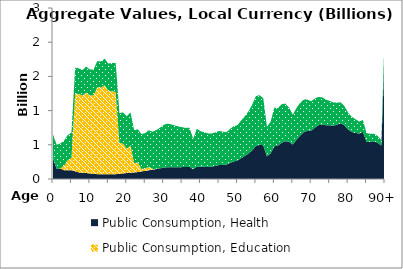
| Category | Public Consumption, Health | Public Consumption, Education | Public Consumption, Other than health and education |
|---|---|---|---|
| 0 | 300.866 | 0 | 352.346 |
|  | 146.781 | 0 | 354.157 |
| 2 | 154.126 | 0 | 365.385 |
| 3 | 127.384 | 66.551 | 368.54 |
| 4 | 126.162 | 148.679 | 367.646 |
| 5 | 126.789 | 182.113 | 368.362 |
| 6 | 113.306 | 1138.534 | 376.295 |
| 7 | 96.704 | 1146.017 | 374.457 |
| 8 | 90.934 | 1129.607 | 373.314 |
| 9 | 86.908 | 1177.485 | 379.509 |
| 10 | 81.618 | 1138.629 | 380.697 |
| 11 | 74.947 | 1150.456 | 375.146 |
| 12 | 70.681 | 1270.447 | 381.81 |
| 13 | 69.088 | 1267.819 | 381.672 |
| 14 | 69.175 | 1300.204 | 390.986 |
| 15 | 68.929 | 1219.326 | 398.759 |
| 16 | 69.943 | 1213.626 | 414.451 |
| 17 | 70.208 | 1200.161 | 426.375 |
| 18 | 74.71 | 453.248 | 436.036 |
| 19 | 81.113 | 436.685 | 455.783 |
| 20 | 87.741 | 354.398 | 475.148 |
| 21 | 92.15 | 399.444 | 481.649 |
| 22 | 95.252 | 137.546 | 481.403 |
| 23 | 101.462 | 138.997 | 486.878 |
| 24 | 111.629 | 34.929 | 510.142 |
| 25 | 118.828 | 34.645 | 518.174 |
| 26 | 127.991 | 50.524 | 533.818 |
| 27 | 136.086 | 12.276 | 543.647 |
| 28 | 145.536 | 0 | 569.583 |
| 29 | 155.027 | 0 | 594.767 |
| 30 | 166.348 | 0 | 625.601 |
| 31 | 172.814 | 0 | 637.398 |
| 32 | 172.83 | 0 | 625.88 |
| 33 | 172.979 | 0 | 610.825 |
| 34 | 172.867 | 0 | 595.589 |
| 35 | 173.575 | 0 | 583.921 |
| 36 | 174.412 | 0 | 572.505 |
| 37 | 178.357 | 0 | 572.787 |
| 38 | 141.935 | 0 | 446.194 |
| 39 | 180.167 | 0 | 555.023 |
| 40 | 178.219 | 0 | 519.096 |
| 41 | 177.731 | 0 | 507.954 |
| 42 | 175.351 | 0 | 491.735 |
| 43 | 181.198 | 0 | 484.689 |
| 44 | 191.273 | 0 | 489.647 |
| 45 | 203.644 | 0 | 499.507 |
| 46 | 206.561 | 0 | 486.647 |
| 47 | 209.283 | 0 | 474.178 |
| 48 | 233.9 | 0 | 499.089 |
| 49 | 256.099 | 0 | 516.486 |
| 50 | 270.482 | 0 | 516.953 |
| 51 | 303.261 | 0 | 550.835 |
| 52 | 336.424 | 0 | 581.509 |
| 53 | 374.113 | 0 | 617.267 |
| 54 | 421.23 | 0 | 665.125 |
| 55 | 482.352 | 0 | 729.183 |
| 56 | 501.169 | 0 | 724.689 |
| 57 | 492.704 | 0 | 689.083 |
| 58 | 330.541 | 0 | 431.939 |
| 59 | 374.439 | 0 | 464.047 |
| 60 | 478.352 | 0 | 565.249 |
| 61 | 488.355 | 0 | 548.737 |
| 62 | 530.73 | 0 | 564.349 |
| 63 | 553.979 | 0 | 548.416 |
| 64 | 543.098 | 0 | 500.702 |
| 65 | 503.859 | 0 | 435.977 |
| 66 | 571.842 | 0 | 465.795 |
| 67 | 634.719 | 0 | 479.964 |
| 68 | 686.625 | 0 | 477.526 |
| 69 | 704.292 | 0 | 455.74 |
| 70 | 708.156 | 0 | 428.816 |
| 71 | 750.426 | 0 | 427.043 |
| 72 | 786.161 | 0 | 413.049 |
| 73 | 798.164 | 0 | 396.427 |
| 74 | 785.11 | 0 | 372.812 |
| 75 | 785.431 | 0 | 357.315 |
| 76 | 779.155 | 0 | 340.169 |
| 77 | 794.23 | 0 | 321.806 |
| 78 | 814.38 | 0 | 307.402 |
| 79 | 784.799 | 0 | 280.511 |
| 80 | 724.326 | 0 | 245.692 |
| 81 | 686.695 | 0 | 221.944 |
| 82 | 674.894 | 0 | 199.51 |
| 83 | 662.232 | 0 | 178.667 |
| 84 | 688.183 | 0 | 173.85 |
| 85 | 542.585 | 0 | 128.824 |
| 86 | 539.665 | 0 | 120.92 |
| 87 | 552.434 | 0 | 109.354 |
| 88 | 532.116 | 0 | 98.323 |
| 89 | 486.535 | 0 | 84.292 |
| 90+ | 1964.019 | 0 | 320.283 |